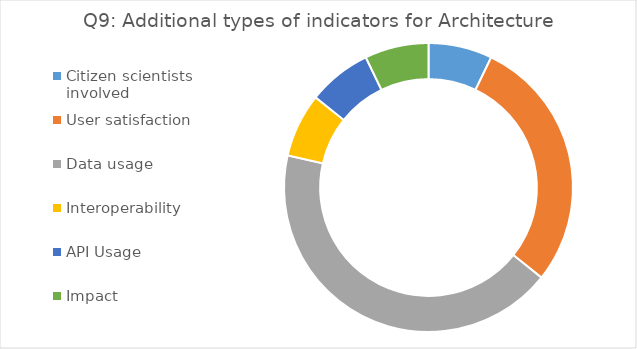
| Category | Series 0 |
|---|---|
| Citizen scientists involved | 1 |
| User satisfaction | 4 |
| Data usage  | 6 |
| Interoperability | 1 |
| API Usage | 1 |
| Impact | 1 |